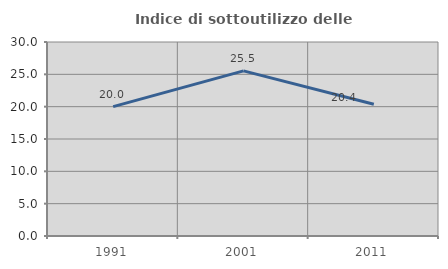
| Category | Indice di sottoutilizzo delle abitazioni  |
|---|---|
| 1991.0 | 20 |
| 2001.0 | 25.532 |
| 2011.0 | 20.37 |